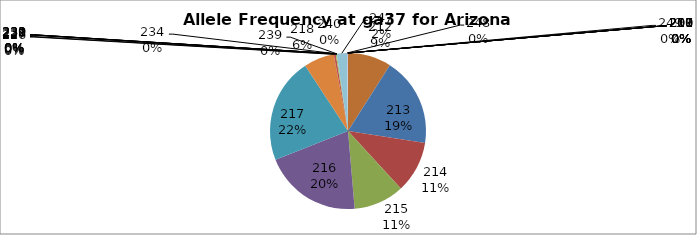
| Category | Series 0 |
|---|---|
| 207.0 | 0 |
| 208.0 | 0 |
| 209.0 | 0 |
| 210.0 | 0 |
| 211.0 | 0 |
| 212.0 | 0.09 |
| 213.0 | 0.184 |
| 214.0 | 0.107 |
| 215.0 | 0.105 |
| 216.0 | 0.203 |
| 217.0 | 0.218 |
| 218.0 | 0.063 |
| 226.0 | 0 |
| 227.0 | 0.004 |
| 228.0 | 0.002 |
| 229.0 | 0 |
| 230.0 | 0 |
| 231.0 | 0 |
| 232.0 | 0 |
| 234.0 | 0 |
| 239.0 | 0 |
| 240.0 | 0 |
| 247.0 | 0.021 |
| 248.0 | 0 |
| 249.0 | 0.002 |
| 250.0 | 0 |